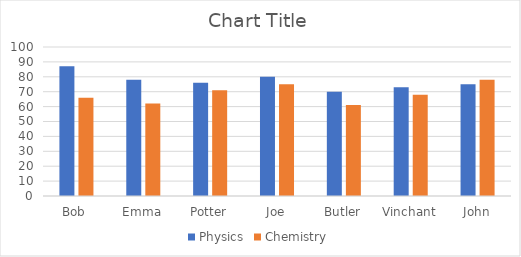
| Category | Physics | Chemistry |
|---|---|---|
| Bob | 87 | 66 |
| Emma | 78 | 62 |
| Potter | 76 | 71 |
| Joe | 80 | 75 |
| Butler | 70 | 61 |
| Vinchant | 73 | 68 |
| John | 75 | 78 |